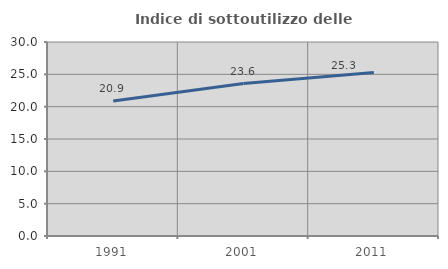
| Category | Indice di sottoutilizzo delle abitazioni  |
|---|---|
| 1991.0 | 20.888 |
| 2001.0 | 23.575 |
| 2011.0 | 25.268 |